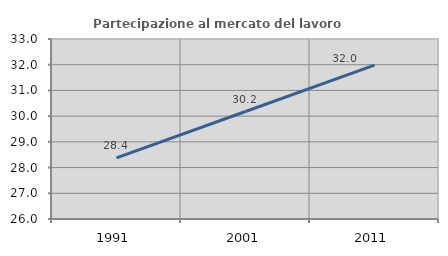
| Category | Partecipazione al mercato del lavoro  femminile |
|---|---|
| 1991.0 | 28.376 |
| 2001.0 | 30.18 |
| 2011.0 | 31.983 |